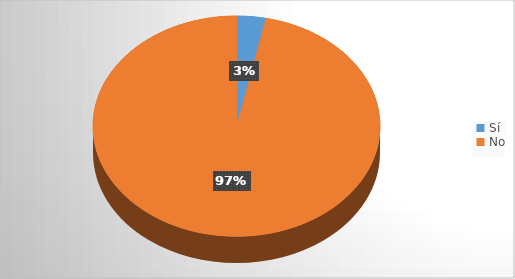
| Category | Series 0 |
|---|---|
| Sí | 40 |
| No | 1186 |